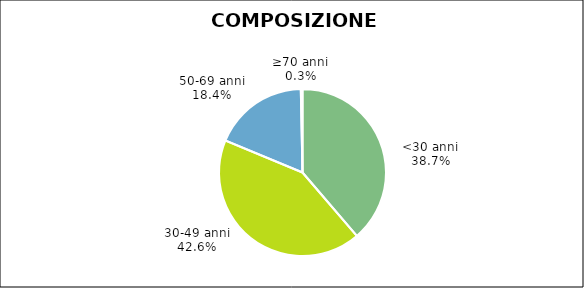
| Category | Series 0 |
|---|---|
| <30 anni | 35217 |
| 30-49 anni | 38674 |
| 50-69 anni | 16748 |
| ≥70 anni | 297 |